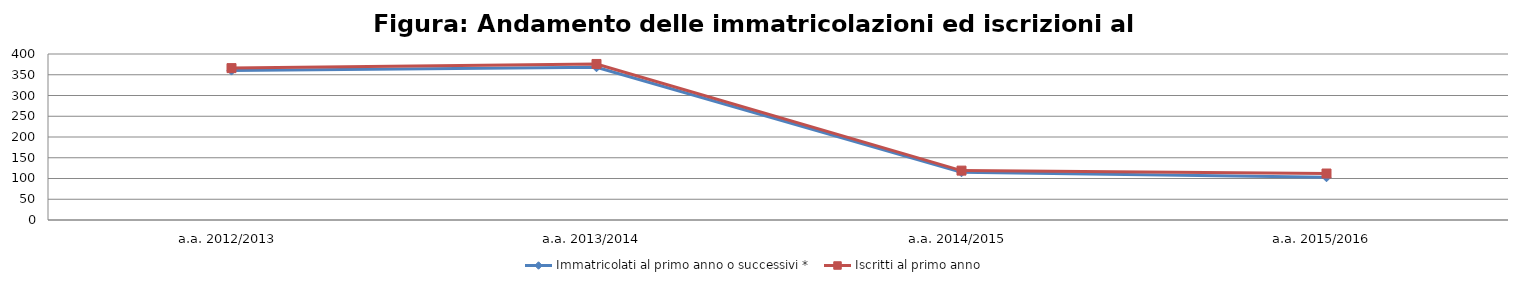
| Category | Immatricolati al primo anno o successivi * | Iscritti al primo anno  |
|---|---|---|
| a.a. 2012/2013 | 360 | 366 |
| a.a. 2013/2014 | 368 | 376 |
| a.a. 2014/2015 | 115 | 119 |
| a.a. 2015/2016 | 103 | 112 |